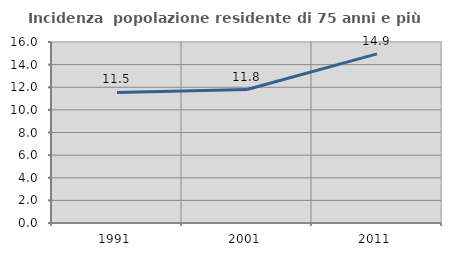
| Category | Incidenza  popolazione residente di 75 anni e più |
|---|---|
| 1991.0 | 11.538 |
| 2001.0 | 11.799 |
| 2011.0 | 14.946 |